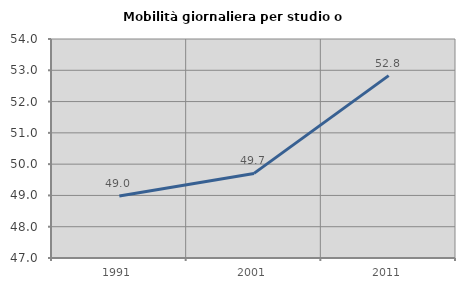
| Category | Mobilità giornaliera per studio o lavoro |
|---|---|
| 1991.0 | 48.98 |
| 2001.0 | 49.704 |
| 2011.0 | 52.83 |